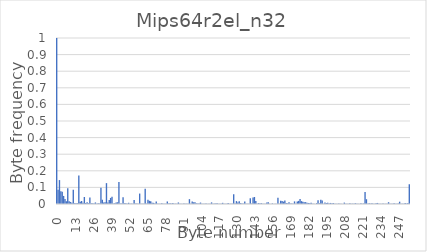
| Category | Series 0 |
|---|---|
| 0.0 | 1 |
| 1.0 | 0.086 |
| 2.0 | 0.144 |
| 3.0 | 0.077 |
| 4.0 | 0.074 |
| 5.0 | 0.049 |
| 6.0 | 0.03 |
| 7.0 | 0.017 |
| 8.0 | 0.094 |
| 9.0 | 0.017 |
| 10.0 | 0.012 |
| 11.0 | 0.007 |
| 12.0 | 0.086 |
| 13.0 | 0.005 |
| 14.0 | 0.005 |
| 15.0 | 0.005 |
| 16.0 | 0.172 |
| 17.0 | 0.013 |
| 18.0 | 0.018 |
| 19.0 | 0.007 |
| 20.0 | 0.042 |
| 21.0 | 0.006 |
| 22.0 | 0.01 |
| 23.0 | 0.005 |
| 24.0 | 0.04 |
| 25.0 | 0.004 |
| 26.0 | 0.004 |
| 27.0 | 0.003 |
| 28.0 | 0.009 |
| 29.0 | 0.002 |
| 30.0 | 0.005 |
| 31.0 | 0.003 |
| 32.0 | 0.097 |
| 33.0 | 0.026 |
| 34.0 | 0.009 |
| 35.0 | 0.011 |
| 36.0 | 0.126 |
| 37.0 | 0.009 |
| 38.0 | 0.023 |
| 39.0 | 0.037 |
| 40.0 | 0.044 |
| 41.0 | 0.003 |
| 42.0 | 0.005 |
| 43.0 | 0.009 |
| 44.0 | 0.01 |
| 45.0 | 0.132 |
| 46.0 | 0.003 |
| 47.0 | 0.003 |
| 48.0 | 0.041 |
| 49.0 | 0.005 |
| 50.0 | 0.004 |
| 51.0 | 0.002 |
| 52.0 | 0.007 |
| 53.0 | 0.002 |
| 54.0 | 0.002 |
| 55.0 | 0.002 |
| 56.0 | 0.024 |
| 57.0 | 0.003 |
| 58.0 | 0.002 |
| 59.0 | 0.002 |
| 60.0 | 0.063 |
| 61.0 | 0.001 |
| 62.0 | 0.002 |
| 63.0 | 0.002 |
| 64.0 | 0.092 |
| 65.0 | 0.002 |
| 66.0 | 0.026 |
| 67.0 | 0.019 |
| 68.0 | 0.016 |
| 69.0 | 0.007 |
| 70.0 | 0.007 |
| 71.0 | 0.003 |
| 72.0 | 0.015 |
| 73.0 | 0.002 |
| 74.0 | 0.002 |
| 75.0 | 0.001 |
| 76.0 | 0.004 |
| 77.0 | 0.001 |
| 78.0 | 0.001 |
| 79.0 | 0.001 |
| 80.0 | 0.015 |
| 81.0 | 0.004 |
| 82.0 | 0.004 |
| 83.0 | 0.002 |
| 84.0 | 0.005 |
| 85.0 | 0.002 |
| 86.0 | 0.002 |
| 87.0 | 0.002 |
| 88.0 | 0.009 |
| 89.0 | 0.002 |
| 90.0 | 0.001 |
| 91.0 | 0.001 |
| 92.0 | 0.003 |
| 93.0 | 0.001 |
| 94.0 | 0.002 |
| 95.0 | 0.001 |
| 96.0 | 0.029 |
| 97.0 | 0.002 |
| 98.0 | 0.016 |
| 99.0 | 0.01 |
| 100.0 | 0.01 |
| 101.0 | 0.004 |
| 102.0 | 0.003 |
| 103.0 | 0.002 |
| 104.0 | 0.009 |
| 105.0 | 0.001 |
| 106.0 | 0.002 |
| 107.0 | 0.001 |
| 108.0 | 0.003 |
| 109.0 | 0.001 |
| 110.0 | 0.001 |
| 111.0 | 0.001 |
| 112.0 | 0.01 |
| 113.0 | 0.002 |
| 114.0 | 0.002 |
| 115.0 | 0.003 |
| 116.0 | 0.004 |
| 117.0 | 0.001 |
| 118.0 | 0.002 |
| 119.0 | 0.001 |
| 120.0 | 0.007 |
| 121.0 | 0.001 |
| 122.0 | 0.001 |
| 123.0 | 0.001 |
| 124.0 | 0.006 |
| 125.0 | 0.001 |
| 126.0 | 0.002 |
| 127.0 | 0.002 |
| 128.0 | 0.059 |
| 129.0 | 0.003 |
| 130.0 | 0.017 |
| 131.0 | 0.009 |
| 132.0 | 0.017 |
| 133.0 | 0.006 |
| 134.0 | 0.003 |
| 135.0 | 0.002 |
| 136.0 | 0.015 |
| 137.0 | 0.002 |
| 138.0 | 0.002 |
| 139.0 | 0.001 |
| 140.0 | 0.035 |
| 141.0 | 0.003 |
| 142.0 | 0.039 |
| 143.0 | 0.042 |
| 144.0 | 0.018 |
| 145.0 | 0.002 |
| 146.0 | 0.006 |
| 147.0 | 0.003 |
| 148.0 | 0.005 |
| 149.0 | 0.001 |
| 150.0 | 0.002 |
| 151.0 | 0.001 |
| 152.0 | 0.009 |
| 153.0 | 0.01 |
| 154.0 | 0.001 |
| 155.0 | 0.001 |
| 156.0 | 0.004 |
| 157.0 | 0.001 |
| 158.0 | 0.001 |
| 159.0 | 0.001 |
| 160.0 | 0.037 |
| 161.0 | 0.002 |
| 162.0 | 0.02 |
| 163.0 | 0.018 |
| 164.0 | 0.014 |
| 165.0 | 0.021 |
| 166.0 | 0.006 |
| 167.0 | 0.004 |
| 168.0 | 0.011 |
| 169.0 | 0.003 |
| 170.0 | 0.003 |
| 171.0 | 0.002 |
| 172.0 | 0.016 |
| 173.0 | 0.002 |
| 174.0 | 0.015 |
| 175.0 | 0.019 |
| 176.0 | 0.03 |
| 177.0 | 0.017 |
| 178.0 | 0.014 |
| 179.0 | 0.011 |
| 180.0 | 0.011 |
| 181.0 | 0.008 |
| 182.0 | 0.006 |
| 183.0 | 0.005 |
| 184.0 | 0.008 |
| 185.0 | 0.002 |
| 186.0 | 0.001 |
| 187.0 | 0.001 |
| 188.0 | 0.005 |
| 189.0 | 0.023 |
| 190.0 | 0.005 |
| 191.0 | 0.025 |
| 192.0 | 0.021 |
| 193.0 | 0.001 |
| 194.0 | 0.009 |
| 195.0 | 0.006 |
| 196.0 | 0.007 |
| 197.0 | 0.003 |
| 198.0 | 0.006 |
| 199.0 | 0.003 |
| 200.0 | 0.007 |
| 201.0 | 0.001 |
| 202.0 | 0.001 |
| 203.0 | 0.001 |
| 204.0 | 0.003 |
| 205.0 | 0.001 |
| 206.0 | 0.001 |
| 207.0 | 0.001 |
| 208.0 | 0.008 |
| 209.0 | 0.001 |
| 210.0 | 0.002 |
| 211.0 | 0.001 |
| 212.0 | 0.004 |
| 213.0 | 0.001 |
| 214.0 | 0.002 |
| 215.0 | 0.002 |
| 216.0 | 0.005 |
| 217.0 | 0.001 |
| 218.0 | 0.001 |
| 219.0 | 0.001 |
| 220.0 | 0.005 |
| 221.0 | 0.001 |
| 222.0 | 0.003 |
| 223.0 | 0.073 |
| 224.0 | 0.029 |
| 225.0 | 0.001 |
| 226.0 | 0.004 |
| 227.0 | 0.002 |
| 228.0 | 0.004 |
| 229.0 | 0.002 |
| 230.0 | 0.002 |
| 231.0 | 0.004 |
| 232.0 | 0.006 |
| 233.0 | 0.001 |
| 234.0 | 0.001 |
| 235.0 | 0.001 |
| 236.0 | 0.003 |
| 237.0 | 0.001 |
| 238.0 | 0.001 |
| 239.0 | 0.001 |
| 240.0 | 0.011 |
| 241.0 | 0.001 |
| 242.0 | 0.002 |
| 243.0 | 0.001 |
| 244.0 | 0.004 |
| 245.0 | 0.001 |
| 246.0 | 0.002 |
| 247.0 | 0.003 |
| 248.0 | 0.014 |
| 249.0 | 0.002 |
| 250.0 | 0.002 |
| 251.0 | 0.002 |
| 252.0 | 0.006 |
| 253.0 | 0.002 |
| 254.0 | 0.006 |
| 255.0 | 0.119 |